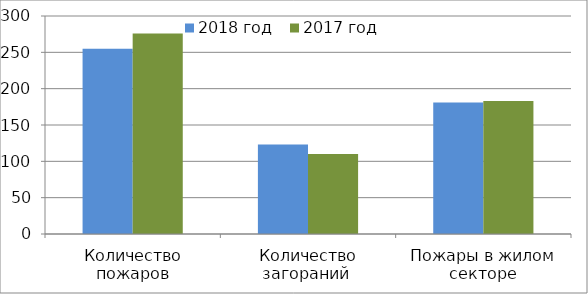
| Category | 2018 год | 2017 год |
|---|---|---|
| Количество пожаров | 255 | 276 |
| Количество загораний  | 123 | 110 |
| Пожары в жилом секторе | 181 | 183 |